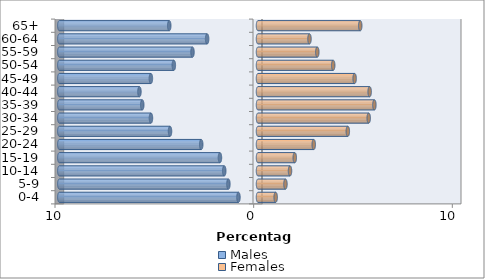
| Category | Males | Females |
|---|---|---|
| 0-4 | -0.984 | 0.89 |
| 5-9 | -1.49 | 1.381 |
| 10-14 | -1.7 | 1.611 |
| 15-19 | -1.915 | 1.851 |
| 20-24 | -2.858 | 2.806 |
| 25-29 | -4.429 | 4.521 |
| 30-34 | -5.389 | 5.573 |
| 35-39 | -5.827 | 5.859 |
| 40-44 | -5.968 | 5.62 |
| 45-49 | -5.392 | 4.864 |
| 50-54 | -4.237 | 3.785 |
| 55-59 | -3.298 | 2.985 |
| 60-64 | -2.561 | 2.591 |
| 65+ | -4.468 | 5.146 |